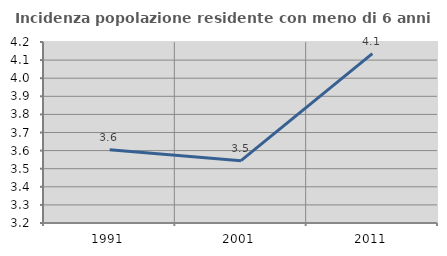
| Category | Incidenza popolazione residente con meno di 6 anni |
|---|---|
| 1991.0 | 3.605 |
| 2001.0 | 3.544 |
| 2011.0 | 4.135 |